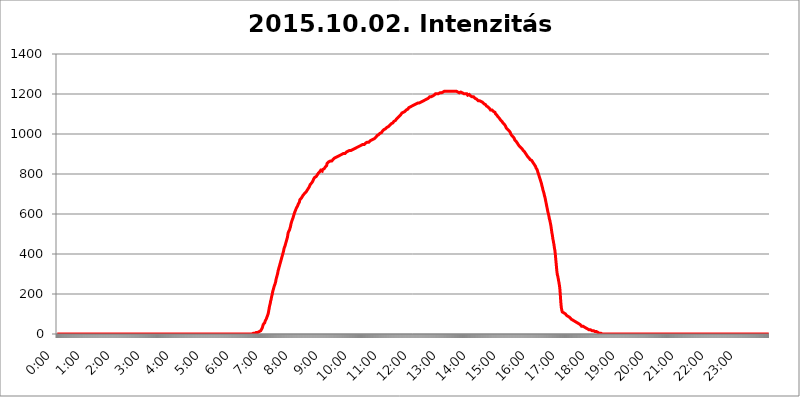
| Category | 2015.10.02. Intenzitás [W/m^2] |
|---|---|
| 0.0 | 0 |
| 0.0006944444444444445 | 0 |
| 0.001388888888888889 | 0 |
| 0.0020833333333333333 | 0 |
| 0.002777777777777778 | 0 |
| 0.003472222222222222 | 0 |
| 0.004166666666666667 | 0 |
| 0.004861111111111111 | 0 |
| 0.005555555555555556 | 0 |
| 0.0062499999999999995 | 0 |
| 0.006944444444444444 | 0 |
| 0.007638888888888889 | 0 |
| 0.008333333333333333 | 0 |
| 0.009027777777777779 | 0 |
| 0.009722222222222222 | 0 |
| 0.010416666666666666 | 0 |
| 0.011111111111111112 | 0 |
| 0.011805555555555555 | 0 |
| 0.012499999999999999 | 0 |
| 0.013194444444444444 | 0 |
| 0.013888888888888888 | 0 |
| 0.014583333333333332 | 0 |
| 0.015277777777777777 | 0 |
| 0.015972222222222224 | 0 |
| 0.016666666666666666 | 0 |
| 0.017361111111111112 | 0 |
| 0.018055555555555557 | 0 |
| 0.01875 | 0 |
| 0.019444444444444445 | 0 |
| 0.02013888888888889 | 0 |
| 0.020833333333333332 | 0 |
| 0.02152777777777778 | 0 |
| 0.022222222222222223 | 0 |
| 0.02291666666666667 | 0 |
| 0.02361111111111111 | 0 |
| 0.024305555555555556 | 0 |
| 0.024999999999999998 | 0 |
| 0.025694444444444447 | 0 |
| 0.02638888888888889 | 0 |
| 0.027083333333333334 | 0 |
| 0.027777777777777776 | 0 |
| 0.02847222222222222 | 0 |
| 0.029166666666666664 | 0 |
| 0.029861111111111113 | 0 |
| 0.030555555555555555 | 0 |
| 0.03125 | 0 |
| 0.03194444444444445 | 0 |
| 0.03263888888888889 | 0 |
| 0.03333333333333333 | 0 |
| 0.034027777777777775 | 0 |
| 0.034722222222222224 | 0 |
| 0.035416666666666666 | 0 |
| 0.036111111111111115 | 0 |
| 0.03680555555555556 | 0 |
| 0.0375 | 0 |
| 0.03819444444444444 | 0 |
| 0.03888888888888889 | 0 |
| 0.03958333333333333 | 0 |
| 0.04027777777777778 | 0 |
| 0.04097222222222222 | 0 |
| 0.041666666666666664 | 0 |
| 0.042361111111111106 | 0 |
| 0.04305555555555556 | 0 |
| 0.043750000000000004 | 0 |
| 0.044444444444444446 | 0 |
| 0.04513888888888889 | 0 |
| 0.04583333333333334 | 0 |
| 0.04652777777777778 | 0 |
| 0.04722222222222222 | 0 |
| 0.04791666666666666 | 0 |
| 0.04861111111111111 | 0 |
| 0.049305555555555554 | 0 |
| 0.049999999999999996 | 0 |
| 0.05069444444444445 | 0 |
| 0.051388888888888894 | 0 |
| 0.052083333333333336 | 0 |
| 0.05277777777777778 | 0 |
| 0.05347222222222222 | 0 |
| 0.05416666666666667 | 0 |
| 0.05486111111111111 | 0 |
| 0.05555555555555555 | 0 |
| 0.05625 | 0 |
| 0.05694444444444444 | 0 |
| 0.057638888888888885 | 0 |
| 0.05833333333333333 | 0 |
| 0.05902777777777778 | 0 |
| 0.059722222222222225 | 0 |
| 0.06041666666666667 | 0 |
| 0.061111111111111116 | 0 |
| 0.06180555555555556 | 0 |
| 0.0625 | 0 |
| 0.06319444444444444 | 0 |
| 0.06388888888888888 | 0 |
| 0.06458333333333334 | 0 |
| 0.06527777777777778 | 0 |
| 0.06597222222222222 | 0 |
| 0.06666666666666667 | 0 |
| 0.06736111111111111 | 0 |
| 0.06805555555555555 | 0 |
| 0.06874999999999999 | 0 |
| 0.06944444444444443 | 0 |
| 0.07013888888888889 | 0 |
| 0.07083333333333333 | 0 |
| 0.07152777777777779 | 0 |
| 0.07222222222222223 | 0 |
| 0.07291666666666667 | 0 |
| 0.07361111111111111 | 0 |
| 0.07430555555555556 | 0 |
| 0.075 | 0 |
| 0.07569444444444444 | 0 |
| 0.0763888888888889 | 0 |
| 0.07708333333333334 | 0 |
| 0.07777777777777778 | 0 |
| 0.07847222222222222 | 0 |
| 0.07916666666666666 | 0 |
| 0.0798611111111111 | 0 |
| 0.08055555555555556 | 0 |
| 0.08125 | 0 |
| 0.08194444444444444 | 0 |
| 0.08263888888888889 | 0 |
| 0.08333333333333333 | 0 |
| 0.08402777777777777 | 0 |
| 0.08472222222222221 | 0 |
| 0.08541666666666665 | 0 |
| 0.08611111111111112 | 0 |
| 0.08680555555555557 | 0 |
| 0.08750000000000001 | 0 |
| 0.08819444444444445 | 0 |
| 0.08888888888888889 | 0 |
| 0.08958333333333333 | 0 |
| 0.09027777777777778 | 0 |
| 0.09097222222222222 | 0 |
| 0.09166666666666667 | 0 |
| 0.09236111111111112 | 0 |
| 0.09305555555555556 | 0 |
| 0.09375 | 0 |
| 0.09444444444444444 | 0 |
| 0.09513888888888888 | 0 |
| 0.09583333333333333 | 0 |
| 0.09652777777777777 | 0 |
| 0.09722222222222222 | 0 |
| 0.09791666666666667 | 0 |
| 0.09861111111111111 | 0 |
| 0.09930555555555555 | 0 |
| 0.09999999999999999 | 0 |
| 0.10069444444444443 | 0 |
| 0.1013888888888889 | 0 |
| 0.10208333333333335 | 0 |
| 0.10277777777777779 | 0 |
| 0.10347222222222223 | 0 |
| 0.10416666666666667 | 0 |
| 0.10486111111111111 | 0 |
| 0.10555555555555556 | 0 |
| 0.10625 | 0 |
| 0.10694444444444444 | 0 |
| 0.1076388888888889 | 0 |
| 0.10833333333333334 | 0 |
| 0.10902777777777778 | 0 |
| 0.10972222222222222 | 0 |
| 0.1111111111111111 | 0 |
| 0.11180555555555556 | 0 |
| 0.11180555555555556 | 0 |
| 0.1125 | 0 |
| 0.11319444444444444 | 0 |
| 0.11388888888888889 | 0 |
| 0.11458333333333333 | 0 |
| 0.11527777777777777 | 0 |
| 0.11597222222222221 | 0 |
| 0.11666666666666665 | 0 |
| 0.1173611111111111 | 0 |
| 0.11805555555555557 | 0 |
| 0.11944444444444445 | 0 |
| 0.12013888888888889 | 0 |
| 0.12083333333333333 | 0 |
| 0.12152777777777778 | 0 |
| 0.12222222222222223 | 0 |
| 0.12291666666666667 | 0 |
| 0.12291666666666667 | 0 |
| 0.12361111111111112 | 0 |
| 0.12430555555555556 | 0 |
| 0.125 | 0 |
| 0.12569444444444444 | 0 |
| 0.12638888888888888 | 0 |
| 0.12708333333333333 | 0 |
| 0.16875 | 0 |
| 0.12847222222222224 | 0 |
| 0.12916666666666668 | 0 |
| 0.12986111111111112 | 0 |
| 0.13055555555555556 | 0 |
| 0.13125 | 0 |
| 0.13194444444444445 | 0 |
| 0.1326388888888889 | 0 |
| 0.13333333333333333 | 0 |
| 0.13402777777777777 | 0 |
| 0.13402777777777777 | 0 |
| 0.13472222222222222 | 0 |
| 0.13541666666666666 | 0 |
| 0.1361111111111111 | 0 |
| 0.13749999999999998 | 0 |
| 0.13819444444444443 | 0 |
| 0.1388888888888889 | 0 |
| 0.13958333333333334 | 0 |
| 0.14027777777777778 | 0 |
| 0.14097222222222222 | 0 |
| 0.14166666666666666 | 0 |
| 0.1423611111111111 | 0 |
| 0.14305555555555557 | 0 |
| 0.14375000000000002 | 0 |
| 0.14444444444444446 | 0 |
| 0.1451388888888889 | 0 |
| 0.1451388888888889 | 0 |
| 0.14652777777777778 | 0 |
| 0.14722222222222223 | 0 |
| 0.14791666666666667 | 0 |
| 0.1486111111111111 | 0 |
| 0.14930555555555555 | 0 |
| 0.15 | 0 |
| 0.15069444444444444 | 0 |
| 0.15138888888888888 | 0 |
| 0.15208333333333332 | 0 |
| 0.15277777777777776 | 0 |
| 0.15347222222222223 | 0 |
| 0.15416666666666667 | 0 |
| 0.15486111111111112 | 0 |
| 0.15555555555555556 | 0 |
| 0.15625 | 0 |
| 0.15694444444444444 | 0 |
| 0.15763888888888888 | 0 |
| 0.15833333333333333 | 0 |
| 0.15902777777777777 | 0 |
| 0.15972222222222224 | 0 |
| 0.16041666666666668 | 0 |
| 0.16111111111111112 | 0 |
| 0.16180555555555556 | 0 |
| 0.1625 | 0 |
| 0.16319444444444445 | 0 |
| 0.1638888888888889 | 0 |
| 0.16458333333333333 | 0 |
| 0.16527777777777777 | 0 |
| 0.16597222222222222 | 0 |
| 0.16666666666666666 | 0 |
| 0.1673611111111111 | 0 |
| 0.16805555555555554 | 0 |
| 0.16874999999999998 | 0 |
| 0.16944444444444443 | 0 |
| 0.17013888888888887 | 0 |
| 0.1708333333333333 | 0 |
| 0.17152777777777775 | 0 |
| 0.17222222222222225 | 0 |
| 0.1729166666666667 | 0 |
| 0.17361111111111113 | 0 |
| 0.17430555555555557 | 0 |
| 0.17500000000000002 | 0 |
| 0.17569444444444446 | 0 |
| 0.1763888888888889 | 0 |
| 0.17708333333333334 | 0 |
| 0.17777777777777778 | 0 |
| 0.17847222222222223 | 0 |
| 0.17916666666666667 | 0 |
| 0.1798611111111111 | 0 |
| 0.18055555555555555 | 0 |
| 0.18125 | 0 |
| 0.18194444444444444 | 0 |
| 0.1826388888888889 | 0 |
| 0.18333333333333335 | 0 |
| 0.1840277777777778 | 0 |
| 0.18472222222222223 | 0 |
| 0.18541666666666667 | 0 |
| 0.18611111111111112 | 0 |
| 0.18680555555555556 | 0 |
| 0.1875 | 0 |
| 0.18819444444444444 | 0 |
| 0.18888888888888888 | 0 |
| 0.18958333333333333 | 0 |
| 0.19027777777777777 | 0 |
| 0.1909722222222222 | 0 |
| 0.19166666666666665 | 0 |
| 0.19236111111111112 | 0 |
| 0.19305555555555554 | 0 |
| 0.19375 | 0 |
| 0.19444444444444445 | 0 |
| 0.1951388888888889 | 0 |
| 0.19583333333333333 | 0 |
| 0.19652777777777777 | 0 |
| 0.19722222222222222 | 0 |
| 0.19791666666666666 | 0 |
| 0.1986111111111111 | 0 |
| 0.19930555555555554 | 0 |
| 0.19999999999999998 | 0 |
| 0.20069444444444443 | 0 |
| 0.20138888888888887 | 0 |
| 0.2020833333333333 | 0 |
| 0.2027777777777778 | 0 |
| 0.2034722222222222 | 0 |
| 0.2041666666666667 | 0 |
| 0.20486111111111113 | 0 |
| 0.20555555555555557 | 0 |
| 0.20625000000000002 | 0 |
| 0.20694444444444446 | 0 |
| 0.2076388888888889 | 0 |
| 0.20833333333333334 | 0 |
| 0.20902777777777778 | 0 |
| 0.20972222222222223 | 0 |
| 0.21041666666666667 | 0 |
| 0.2111111111111111 | 0 |
| 0.21180555555555555 | 0 |
| 0.2125 | 0 |
| 0.21319444444444444 | 0 |
| 0.2138888888888889 | 0 |
| 0.21458333333333335 | 0 |
| 0.2152777777777778 | 0 |
| 0.21597222222222223 | 0 |
| 0.21666666666666667 | 0 |
| 0.21736111111111112 | 0 |
| 0.21805555555555556 | 0 |
| 0.21875 | 0 |
| 0.21944444444444444 | 0 |
| 0.22013888888888888 | 0 |
| 0.22083333333333333 | 0 |
| 0.22152777777777777 | 0 |
| 0.2222222222222222 | 0 |
| 0.22291666666666665 | 0 |
| 0.2236111111111111 | 0 |
| 0.22430555555555556 | 0 |
| 0.225 | 0 |
| 0.22569444444444445 | 0 |
| 0.2263888888888889 | 0 |
| 0.22708333333333333 | 0 |
| 0.22777777777777777 | 0 |
| 0.22847222222222222 | 0 |
| 0.22916666666666666 | 0 |
| 0.2298611111111111 | 0 |
| 0.23055555555555554 | 0 |
| 0.23124999999999998 | 0 |
| 0.23194444444444443 | 0 |
| 0.23263888888888887 | 0 |
| 0.2333333333333333 | 0 |
| 0.2340277777777778 | 0 |
| 0.2347222222222222 | 0 |
| 0.2354166666666667 | 0 |
| 0.23611111111111113 | 0 |
| 0.23680555555555557 | 0 |
| 0.23750000000000002 | 0 |
| 0.23819444444444446 | 0 |
| 0.2388888888888889 | 0 |
| 0.23958333333333334 | 0 |
| 0.24027777777777778 | 0 |
| 0.24097222222222223 | 0 |
| 0.24166666666666667 | 0 |
| 0.2423611111111111 | 0 |
| 0.24305555555555555 | 0 |
| 0.24375 | 0 |
| 0.24444444444444446 | 0 |
| 0.24513888888888888 | 0 |
| 0.24583333333333335 | 0 |
| 0.2465277777777778 | 0 |
| 0.24722222222222223 | 0 |
| 0.24791666666666667 | 0 |
| 0.24861111111111112 | 0 |
| 0.24930555555555556 | 0 |
| 0.25 | 0 |
| 0.25069444444444444 | 0 |
| 0.2513888888888889 | 0 |
| 0.2520833333333333 | 0 |
| 0.25277777777777777 | 0 |
| 0.2534722222222222 | 0 |
| 0.25416666666666665 | 0 |
| 0.2548611111111111 | 0 |
| 0.2555555555555556 | 0 |
| 0.25625000000000003 | 0 |
| 0.2569444444444445 | 0 |
| 0.2576388888888889 | 0 |
| 0.25833333333333336 | 0 |
| 0.2590277777777778 | 0 |
| 0.25972222222222224 | 0 |
| 0.2604166666666667 | 0 |
| 0.2611111111111111 | 0 |
| 0.26180555555555557 | 0 |
| 0.2625 | 0 |
| 0.26319444444444445 | 0 |
| 0.2638888888888889 | 0 |
| 0.26458333333333334 | 0 |
| 0.2652777777777778 | 0 |
| 0.2659722222222222 | 0 |
| 0.26666666666666666 | 0 |
| 0.2673611111111111 | 0 |
| 0.26805555555555555 | 0 |
| 0.26875 | 0 |
| 0.26944444444444443 | 0 |
| 0.2701388888888889 | 0 |
| 0.2708333333333333 | 0 |
| 0.27152777777777776 | 0 |
| 0.2722222222222222 | 0 |
| 0.27291666666666664 | 0 |
| 0.2736111111111111 | 0 |
| 0.2743055555555555 | 3.525 |
| 0.27499999999999997 | 3.525 |
| 0.27569444444444446 | 3.525 |
| 0.27638888888888885 | 3.525 |
| 0.27708333333333335 | 3.525 |
| 0.2777777777777778 | 3.525 |
| 0.27847222222222223 | 3.525 |
| 0.2791666666666667 | 7.887 |
| 0.2798611111111111 | 7.887 |
| 0.28055555555555556 | 7.887 |
| 0.28125 | 7.887 |
| 0.28194444444444444 | 12.257 |
| 0.2826388888888889 | 12.257 |
| 0.2833333333333333 | 12.257 |
| 0.28402777777777777 | 12.257 |
| 0.2847222222222222 | 12.257 |
| 0.28541666666666665 | 16.636 |
| 0.28611111111111115 | 16.636 |
| 0.28680555555555554 | 21.024 |
| 0.28750000000000003 | 29.823 |
| 0.2881944444444445 | 38.653 |
| 0.2888888888888889 | 47.511 |
| 0.28958333333333336 | 51.951 |
| 0.2902777777777778 | 51.951 |
| 0.29097222222222224 | 56.398 |
| 0.2916666666666667 | 65.31 |
| 0.2923611111111111 | 69.775 |
| 0.29305555555555557 | 74.246 |
| 0.29375 | 78.722 |
| 0.29444444444444445 | 87.692 |
| 0.2951388888888889 | 92.184 |
| 0.29583333333333334 | 101.184 |
| 0.2965277777777778 | 114.716 |
| 0.2972222222222222 | 128.284 |
| 0.29791666666666666 | 141.884 |
| 0.2986111111111111 | 150.964 |
| 0.29930555555555555 | 164.605 |
| 0.3 | 173.709 |
| 0.30069444444444443 | 187.378 |
| 0.3013888888888889 | 196.497 |
| 0.3020833333333333 | 210.182 |
| 0.30277777777777776 | 219.309 |
| 0.3034722222222222 | 228.436 |
| 0.30416666666666664 | 237.564 |
| 0.3048611111111111 | 242.127 |
| 0.3055555555555555 | 251.251 |
| 0.30624999999999997 | 260.373 |
| 0.3069444444444444 | 274.047 |
| 0.3076388888888889 | 283.156 |
| 0.30833333333333335 | 292.259 |
| 0.3090277777777778 | 301.354 |
| 0.30972222222222223 | 314.98 |
| 0.3104166666666667 | 324.052 |
| 0.3111111111111111 | 333.113 |
| 0.31180555555555556 | 342.162 |
| 0.3125 | 351.198 |
| 0.31319444444444444 | 360.221 |
| 0.3138888888888889 | 369.23 |
| 0.3145833333333333 | 378.224 |
| 0.31527777777777777 | 387.202 |
| 0.3159722222222222 | 396.164 |
| 0.31666666666666665 | 405.108 |
| 0.31736111111111115 | 414.035 |
| 0.31805555555555554 | 427.39 |
| 0.31875000000000003 | 431.833 |
| 0.3194444444444445 | 440.702 |
| 0.3201388888888889 | 449.551 |
| 0.32083333333333336 | 458.38 |
| 0.3215277777777778 | 467.187 |
| 0.32222222222222224 | 475.972 |
| 0.3229166666666667 | 484.735 |
| 0.3236111111111111 | 502.192 |
| 0.32430555555555557 | 510.885 |
| 0.325 | 515.223 |
| 0.32569444444444445 | 519.555 |
| 0.3263888888888889 | 528.2 |
| 0.32708333333333334 | 536.82 |
| 0.3277777777777778 | 549.704 |
| 0.3284722222222222 | 558.261 |
| 0.32916666666666666 | 566.793 |
| 0.3298611111111111 | 571.049 |
| 0.33055555555555555 | 579.542 |
| 0.33125 | 588.009 |
| 0.33194444444444443 | 596.45 |
| 0.3326388888888889 | 604.864 |
| 0.3333333333333333 | 609.062 |
| 0.3340277777777778 | 617.436 |
| 0.3347222222222222 | 621.613 |
| 0.3354166666666667 | 629.948 |
| 0.3361111111111111 | 634.105 |
| 0.3368055555555556 | 638.256 |
| 0.33749999999999997 | 642.4 |
| 0.33819444444444446 | 650.667 |
| 0.33888888888888885 | 654.791 |
| 0.33958333333333335 | 658.909 |
| 0.34027777777777773 | 671.22 |
| 0.34097222222222223 | 675.311 |
| 0.3416666666666666 | 675.311 |
| 0.3423611111111111 | 679.395 |
| 0.3430555555555555 | 683.473 |
| 0.34375 | 687.544 |
| 0.3444444444444445 | 691.608 |
| 0.3451388888888889 | 695.666 |
| 0.3458333333333334 | 695.666 |
| 0.34652777777777777 | 699.717 |
| 0.34722222222222227 | 703.762 |
| 0.34791666666666665 | 707.8 |
| 0.34861111111111115 | 707.8 |
| 0.34930555555555554 | 711.832 |
| 0.35000000000000003 | 715.858 |
| 0.3506944444444444 | 719.877 |
| 0.3513888888888889 | 723.889 |
| 0.3520833333333333 | 727.896 |
| 0.3527777777777778 | 731.896 |
| 0.3534722222222222 | 735.89 |
| 0.3541666666666667 | 739.877 |
| 0.3548611111111111 | 747.834 |
| 0.35555555555555557 | 751.803 |
| 0.35625 | 751.803 |
| 0.35694444444444445 | 755.766 |
| 0.3576388888888889 | 759.723 |
| 0.35833333333333334 | 763.674 |
| 0.3590277777777778 | 767.62 |
| 0.3597222222222222 | 775.492 |
| 0.36041666666666666 | 775.492 |
| 0.3611111111111111 | 783.342 |
| 0.36180555555555555 | 787.258 |
| 0.3625 | 787.258 |
| 0.36319444444444443 | 787.258 |
| 0.3638888888888889 | 791.169 |
| 0.3645833333333333 | 795.074 |
| 0.3652777777777778 | 798.974 |
| 0.3659722222222222 | 802.868 |
| 0.3666666666666667 | 802.868 |
| 0.3673611111111111 | 806.757 |
| 0.3680555555555556 | 810.641 |
| 0.36874999999999997 | 814.519 |
| 0.36944444444444446 | 818.392 |
| 0.37013888888888885 | 814.519 |
| 0.37083333333333335 | 814.519 |
| 0.37152777777777773 | 814.519 |
| 0.37222222222222223 | 822.26 |
| 0.3729166666666666 | 826.123 |
| 0.3736111111111111 | 826.123 |
| 0.3743055555555555 | 826.123 |
| 0.375 | 829.981 |
| 0.3756944444444445 | 833.834 |
| 0.3763888888888889 | 837.682 |
| 0.3770833333333334 | 837.682 |
| 0.37777777777777777 | 841.526 |
| 0.37847222222222227 | 853.029 |
| 0.37916666666666665 | 853.029 |
| 0.37986111111111115 | 853.029 |
| 0.38055555555555554 | 860.676 |
| 0.38125000000000003 | 856.855 |
| 0.3819444444444444 | 856.855 |
| 0.3826388888888889 | 864.493 |
| 0.3833333333333333 | 860.676 |
| 0.3840277777777778 | 864.493 |
| 0.3847222222222222 | 864.493 |
| 0.3854166666666667 | 868.305 |
| 0.3861111111111111 | 868.305 |
| 0.38680555555555557 | 872.114 |
| 0.3875 | 875.918 |
| 0.38819444444444445 | 875.918 |
| 0.3888888888888889 | 879.719 |
| 0.38958333333333334 | 879.719 |
| 0.3902777777777778 | 879.719 |
| 0.3909722222222222 | 883.516 |
| 0.39166666666666666 | 883.516 |
| 0.3923611111111111 | 883.516 |
| 0.39305555555555555 | 887.309 |
| 0.39375 | 887.309 |
| 0.39444444444444443 | 891.099 |
| 0.3951388888888889 | 891.099 |
| 0.3958333333333333 | 891.099 |
| 0.3965277777777778 | 891.099 |
| 0.3972222222222222 | 894.885 |
| 0.3979166666666667 | 894.885 |
| 0.3986111111111111 | 898.668 |
| 0.3993055555555556 | 898.668 |
| 0.39999999999999997 | 898.668 |
| 0.40069444444444446 | 902.447 |
| 0.40138888888888885 | 902.447 |
| 0.40208333333333335 | 902.447 |
| 0.40277777777777773 | 902.447 |
| 0.40347222222222223 | 902.447 |
| 0.4041666666666666 | 906.223 |
| 0.4048611111111111 | 906.223 |
| 0.4055555555555555 | 909.996 |
| 0.40625 | 909.996 |
| 0.4069444444444445 | 909.996 |
| 0.4076388888888889 | 913.766 |
| 0.4083333333333334 | 913.766 |
| 0.40902777777777777 | 913.766 |
| 0.40972222222222227 | 917.534 |
| 0.41041666666666665 | 917.534 |
| 0.41111111111111115 | 917.534 |
| 0.41180555555555554 | 917.534 |
| 0.41250000000000003 | 921.298 |
| 0.4131944444444444 | 921.298 |
| 0.4138888888888889 | 921.298 |
| 0.4145833333333333 | 925.06 |
| 0.4152777777777778 | 925.06 |
| 0.4159722222222222 | 925.06 |
| 0.4166666666666667 | 925.06 |
| 0.4173611111111111 | 925.06 |
| 0.41805555555555557 | 928.819 |
| 0.41875 | 932.576 |
| 0.41944444444444445 | 932.576 |
| 0.4201388888888889 | 932.576 |
| 0.42083333333333334 | 932.576 |
| 0.4215277777777778 | 936.33 |
| 0.4222222222222222 | 936.33 |
| 0.42291666666666666 | 936.33 |
| 0.4236111111111111 | 940.082 |
| 0.42430555555555555 | 940.082 |
| 0.425 | 940.082 |
| 0.42569444444444443 | 943.832 |
| 0.4263888888888889 | 943.832 |
| 0.4270833333333333 | 940.082 |
| 0.4277777777777778 | 943.832 |
| 0.4284722222222222 | 947.58 |
| 0.4291666666666667 | 947.58 |
| 0.4298611111111111 | 947.58 |
| 0.4305555555555556 | 947.58 |
| 0.43124999999999997 | 951.327 |
| 0.43194444444444446 | 951.327 |
| 0.43263888888888885 | 955.071 |
| 0.43333333333333335 | 955.071 |
| 0.43402777777777773 | 955.071 |
| 0.43472222222222223 | 958.814 |
| 0.4354166666666666 | 958.814 |
| 0.4361111111111111 | 958.814 |
| 0.4368055555555555 | 958.814 |
| 0.4375 | 958.814 |
| 0.4381944444444445 | 958.814 |
| 0.4388888888888889 | 966.295 |
| 0.4395833333333334 | 966.295 |
| 0.44027777777777777 | 970.034 |
| 0.44097222222222227 | 970.034 |
| 0.44166666666666665 | 970.034 |
| 0.44236111111111115 | 970.034 |
| 0.44305555555555554 | 973.772 |
| 0.44375000000000003 | 973.772 |
| 0.4444444444444444 | 977.508 |
| 0.4451388888888889 | 977.508 |
| 0.4458333333333333 | 977.508 |
| 0.4465277777777778 | 981.244 |
| 0.4472222222222222 | 984.98 |
| 0.4479166666666667 | 988.714 |
| 0.4486111111111111 | 992.448 |
| 0.44930555555555557 | 992.448 |
| 0.45 | 996.182 |
| 0.45069444444444445 | 996.182 |
| 0.4513888888888889 | 999.916 |
| 0.45208333333333334 | 999.916 |
| 0.4527777777777778 | 1003.65 |
| 0.4534722222222222 | 1007.383 |
| 0.45416666666666666 | 1003.65 |
| 0.4548611111111111 | 1007.383 |
| 0.45555555555555555 | 1007.383 |
| 0.45625 | 1014.852 |
| 0.45694444444444443 | 1014.852 |
| 0.4576388888888889 | 1018.587 |
| 0.4583333333333333 | 1022.323 |
| 0.4590277777777778 | 1022.323 |
| 0.4597222222222222 | 1022.323 |
| 0.4604166666666667 | 1026.06 |
| 0.4611111111111111 | 1029.798 |
| 0.4618055555555556 | 1029.798 |
| 0.46249999999999997 | 1033.537 |
| 0.46319444444444446 | 1037.277 |
| 0.46388888888888885 | 1033.537 |
| 0.46458333333333335 | 1037.277 |
| 0.46527777777777773 | 1037.277 |
| 0.46597222222222223 | 1041.019 |
| 0.4666666666666666 | 1044.762 |
| 0.4673611111111111 | 1044.762 |
| 0.4680555555555555 | 1048.508 |
| 0.46875 | 1052.255 |
| 0.4694444444444445 | 1048.508 |
| 0.4701388888888889 | 1048.508 |
| 0.4708333333333334 | 1056.004 |
| 0.47152777777777777 | 1059.756 |
| 0.47222222222222227 | 1063.51 |
| 0.47291666666666665 | 1067.267 |
| 0.47361111111111115 | 1067.267 |
| 0.47430555555555554 | 1067.267 |
| 0.47500000000000003 | 1071.027 |
| 0.4756944444444444 | 1074.789 |
| 0.4763888888888889 | 1078.555 |
| 0.4770833333333333 | 1078.555 |
| 0.4777777777777778 | 1082.324 |
| 0.4784722222222222 | 1082.324 |
| 0.4791666666666667 | 1086.097 |
| 0.4798611111111111 | 1089.873 |
| 0.48055555555555557 | 1093.653 |
| 0.48125 | 1093.653 |
| 0.48194444444444445 | 1097.437 |
| 0.4826388888888889 | 1101.226 |
| 0.48333333333333334 | 1105.019 |
| 0.4840277777777778 | 1105.019 |
| 0.4847222222222222 | 1108.816 |
| 0.48541666666666666 | 1108.816 |
| 0.4861111111111111 | 1112.618 |
| 0.48680555555555555 | 1112.618 |
| 0.4875 | 1112.618 |
| 0.48819444444444443 | 1116.426 |
| 0.4888888888888889 | 1116.426 |
| 0.4895833333333333 | 1120.238 |
| 0.4902777777777778 | 1120.238 |
| 0.4909722222222222 | 1124.056 |
| 0.4916666666666667 | 1124.056 |
| 0.4923611111111111 | 1127.879 |
| 0.4930555555555556 | 1131.708 |
| 0.49374999999999997 | 1131.708 |
| 0.49444444444444446 | 1131.708 |
| 0.49513888888888885 | 1135.543 |
| 0.49583333333333335 | 1139.384 |
| 0.49652777777777773 | 1139.384 |
| 0.49722222222222223 | 1139.384 |
| 0.4979166666666666 | 1139.384 |
| 0.4986111111111111 | 1143.232 |
| 0.4993055555555555 | 1143.232 |
| 0.5 | 1143.232 |
| 0.5006944444444444 | 1143.232 |
| 0.5013888888888889 | 1147.086 |
| 0.5020833333333333 | 1147.086 |
| 0.5027777777777778 | 1150.946 |
| 0.5034722222222222 | 1150.946 |
| 0.5041666666666667 | 1154.814 |
| 0.5048611111111111 | 1150.946 |
| 0.5055555555555555 | 1154.814 |
| 0.50625 | 1154.814 |
| 0.5069444444444444 | 1154.814 |
| 0.5076388888888889 | 1154.814 |
| 0.5083333333333333 | 1154.814 |
| 0.5090277777777777 | 1158.689 |
| 0.5097222222222222 | 1158.689 |
| 0.5104166666666666 | 1158.689 |
| 0.5111111111111112 | 1162.571 |
| 0.5118055555555555 | 1162.571 |
| 0.5125000000000001 | 1162.571 |
| 0.5131944444444444 | 1166.46 |
| 0.513888888888889 | 1166.46 |
| 0.5145833333333333 | 1170.358 |
| 0.5152777777777778 | 1170.358 |
| 0.5159722222222222 | 1170.358 |
| 0.5166666666666667 | 1170.358 |
| 0.517361111111111 | 1170.358 |
| 0.5180555555555556 | 1174.263 |
| 0.5187499999999999 | 1174.263 |
| 0.5194444444444445 | 1178.177 |
| 0.5201388888888888 | 1178.177 |
| 0.5208333333333334 | 1182.099 |
| 0.5215277777777778 | 1182.099 |
| 0.5222222222222223 | 1186.03 |
| 0.5229166666666667 | 1186.03 |
| 0.5236111111111111 | 1189.969 |
| 0.5243055555555556 | 1186.03 |
| 0.525 | 1189.969 |
| 0.5256944444444445 | 1189.969 |
| 0.5263888888888889 | 1189.969 |
| 0.5270833333333333 | 1193.918 |
| 0.5277777777777778 | 1193.918 |
| 0.5284722222222222 | 1193.918 |
| 0.5291666666666667 | 1193.918 |
| 0.5298611111111111 | 1197.876 |
| 0.5305555555555556 | 1201.843 |
| 0.53125 | 1197.876 |
| 0.5319444444444444 | 1201.843 |
| 0.5326388888888889 | 1201.843 |
| 0.5333333333333333 | 1201.843 |
| 0.5340277777777778 | 1201.843 |
| 0.5347222222222222 | 1201.843 |
| 0.5354166666666667 | 1205.82 |
| 0.5361111111111111 | 1205.82 |
| 0.5368055555555555 | 1205.82 |
| 0.5375 | 1205.82 |
| 0.5381944444444444 | 1205.82 |
| 0.5388888888888889 | 1205.82 |
| 0.5395833333333333 | 1205.82 |
| 0.5402777777777777 | 1209.807 |
| 0.5409722222222222 | 1209.807 |
| 0.5416666666666666 | 1209.807 |
| 0.5423611111111112 | 1213.804 |
| 0.5430555555555555 | 1213.804 |
| 0.5437500000000001 | 1213.804 |
| 0.5444444444444444 | 1209.807 |
| 0.545138888888889 | 1213.804 |
| 0.5458333333333333 | 1209.807 |
| 0.5465277777777778 | 1213.804 |
| 0.5472222222222222 | 1213.804 |
| 0.5479166666666667 | 1213.804 |
| 0.548611111111111 | 1213.804 |
| 0.5493055555555556 | 1213.804 |
| 0.5499999999999999 | 1213.804 |
| 0.5506944444444445 | 1213.804 |
| 0.5513888888888888 | 1213.804 |
| 0.5520833333333334 | 1213.804 |
| 0.5527777777777778 | 1213.804 |
| 0.5534722222222223 | 1213.804 |
| 0.5541666666666667 | 1213.804 |
| 0.5548611111111111 | 1213.804 |
| 0.5555555555555556 | 1213.804 |
| 0.55625 | 1209.807 |
| 0.5569444444444445 | 1213.804 |
| 0.5576388888888889 | 1213.804 |
| 0.5583333333333333 | 1213.804 |
| 0.5590277777777778 | 1209.807 |
| 0.5597222222222222 | 1213.804 |
| 0.5604166666666667 | 1213.804 |
| 0.5611111111111111 | 1213.804 |
| 0.5618055555555556 | 1209.807 |
| 0.5625 | 1209.807 |
| 0.5631944444444444 | 1209.807 |
| 0.5638888888888889 | 1205.82 |
| 0.5645833333333333 | 1205.82 |
| 0.5652777777777778 | 1205.82 |
| 0.5659722222222222 | 1209.807 |
| 0.5666666666666667 | 1209.807 |
| 0.5673611111111111 | 1205.82 |
| 0.5680555555555555 | 1205.82 |
| 0.56875 | 1205.82 |
| 0.5694444444444444 | 1205.82 |
| 0.5701388888888889 | 1201.843 |
| 0.5708333333333333 | 1201.843 |
| 0.5715277777777777 | 1201.843 |
| 0.5722222222222222 | 1201.843 |
| 0.5729166666666666 | 1201.843 |
| 0.5736111111111112 | 1201.843 |
| 0.5743055555555555 | 1201.843 |
| 0.5750000000000001 | 1197.876 |
| 0.5756944444444444 | 1193.918 |
| 0.576388888888889 | 1193.918 |
| 0.5770833333333333 | 1193.918 |
| 0.5777777777777778 | 1197.876 |
| 0.5784722222222222 | 1193.918 |
| 0.5791666666666667 | 1193.918 |
| 0.579861111111111 | 1189.969 |
| 0.5805555555555556 | 1189.969 |
| 0.5812499999999999 | 1189.969 |
| 0.5819444444444445 | 1186.03 |
| 0.5826388888888888 | 1186.03 |
| 0.5833333333333334 | 1186.03 |
| 0.5840277777777778 | 1186.03 |
| 0.5847222222222223 | 1182.099 |
| 0.5854166666666667 | 1182.099 |
| 0.5861111111111111 | 1178.177 |
| 0.5868055555555556 | 1178.177 |
| 0.5875 | 1174.263 |
| 0.5881944444444445 | 1174.263 |
| 0.5888888888888889 | 1170.358 |
| 0.5895833333333333 | 1170.358 |
| 0.5902777777777778 | 1166.46 |
| 0.5909722222222222 | 1166.46 |
| 0.5916666666666667 | 1166.46 |
| 0.5923611111111111 | 1166.46 |
| 0.5930555555555556 | 1166.46 |
| 0.59375 | 1166.46 |
| 0.5944444444444444 | 1162.571 |
| 0.5951388888888889 | 1162.571 |
| 0.5958333333333333 | 1158.689 |
| 0.5965277777777778 | 1158.689 |
| 0.5972222222222222 | 1158.689 |
| 0.5979166666666667 | 1154.814 |
| 0.5986111111111111 | 1150.946 |
| 0.5993055555555555 | 1150.946 |
| 0.6 | 1147.086 |
| 0.6006944444444444 | 1147.086 |
| 0.6013888888888889 | 1143.232 |
| 0.6020833333333333 | 1139.384 |
| 0.6027777777777777 | 1139.384 |
| 0.6034722222222222 | 1135.543 |
| 0.6041666666666666 | 1135.543 |
| 0.6048611111111112 | 1131.708 |
| 0.6055555555555555 | 1131.708 |
| 0.6062500000000001 | 1127.879 |
| 0.6069444444444444 | 1124.056 |
| 0.607638888888889 | 1120.238 |
| 0.6083333333333333 | 1120.238 |
| 0.6090277777777778 | 1116.426 |
| 0.6097222222222222 | 1120.238 |
| 0.6104166666666667 | 1116.426 |
| 0.611111111111111 | 1116.426 |
| 0.6118055555555556 | 1112.618 |
| 0.6124999999999999 | 1112.618 |
| 0.6131944444444445 | 1108.816 |
| 0.6138888888888888 | 1108.816 |
| 0.6145833333333334 | 1101.226 |
| 0.6152777777777778 | 1101.226 |
| 0.6159722222222223 | 1097.437 |
| 0.6166666666666667 | 1093.653 |
| 0.6173611111111111 | 1089.873 |
| 0.6180555555555556 | 1086.097 |
| 0.61875 | 1086.097 |
| 0.6194444444444445 | 1082.324 |
| 0.6201388888888889 | 1078.555 |
| 0.6208333333333333 | 1074.789 |
| 0.6215277777777778 | 1071.027 |
| 0.6222222222222222 | 1071.027 |
| 0.6229166666666667 | 1067.267 |
| 0.6236111111111111 | 1063.51 |
| 0.6243055555555556 | 1059.756 |
| 0.625 | 1056.004 |
| 0.6256944444444444 | 1052.255 |
| 0.6263888888888889 | 1052.255 |
| 0.6270833333333333 | 1048.508 |
| 0.6277777777777778 | 1044.762 |
| 0.6284722222222222 | 1041.019 |
| 0.6291666666666667 | 1041.019 |
| 0.6298611111111111 | 1029.798 |
| 0.6305555555555555 | 1029.798 |
| 0.63125 | 1026.06 |
| 0.6319444444444444 | 1022.323 |
| 0.6326388888888889 | 1022.323 |
| 0.6333333333333333 | 1018.587 |
| 0.6340277777777777 | 1014.852 |
| 0.6347222222222222 | 1011.118 |
| 0.6354166666666666 | 1007.383 |
| 0.6361111111111112 | 999.916 |
| 0.6368055555555555 | 999.916 |
| 0.6375000000000001 | 992.448 |
| 0.6381944444444444 | 988.714 |
| 0.638888888888889 | 988.714 |
| 0.6395833333333333 | 984.98 |
| 0.6402777777777778 | 981.244 |
| 0.6409722222222222 | 977.508 |
| 0.6416666666666667 | 970.034 |
| 0.642361111111111 | 966.295 |
| 0.6430555555555556 | 966.295 |
| 0.6437499999999999 | 962.555 |
| 0.6444444444444445 | 958.814 |
| 0.6451388888888888 | 955.071 |
| 0.6458333333333334 | 951.327 |
| 0.6465277777777778 | 947.58 |
| 0.6472222222222223 | 943.832 |
| 0.6479166666666667 | 940.082 |
| 0.6486111111111111 | 940.082 |
| 0.6493055555555556 | 936.33 |
| 0.65 | 932.576 |
| 0.6506944444444445 | 932.576 |
| 0.6513888888888889 | 928.819 |
| 0.6520833333333333 | 925.06 |
| 0.6527777777777778 | 921.298 |
| 0.6534722222222222 | 917.534 |
| 0.6541666666666667 | 917.534 |
| 0.6548611111111111 | 913.766 |
| 0.6555555555555556 | 909.996 |
| 0.65625 | 906.223 |
| 0.6569444444444444 | 902.447 |
| 0.6576388888888889 | 898.668 |
| 0.6583333333333333 | 894.885 |
| 0.6590277777777778 | 891.099 |
| 0.6597222222222222 | 887.309 |
| 0.6604166666666667 | 883.516 |
| 0.6611111111111111 | 883.516 |
| 0.6618055555555555 | 879.719 |
| 0.6625 | 875.918 |
| 0.6631944444444444 | 872.114 |
| 0.6638888888888889 | 872.114 |
| 0.6645833333333333 | 868.305 |
| 0.6652777777777777 | 868.305 |
| 0.6659722222222222 | 864.493 |
| 0.6666666666666666 | 860.676 |
| 0.6673611111111111 | 856.855 |
| 0.6680555555555556 | 853.029 |
| 0.6687500000000001 | 849.199 |
| 0.6694444444444444 | 845.365 |
| 0.6701388888888888 | 841.526 |
| 0.6708333333333334 | 837.682 |
| 0.6715277777777778 | 829.981 |
| 0.6722222222222222 | 826.123 |
| 0.6729166666666666 | 822.26 |
| 0.6736111111111112 | 814.519 |
| 0.6743055555555556 | 806.757 |
| 0.6749999999999999 | 798.974 |
| 0.6756944444444444 | 795.074 |
| 0.6763888888888889 | 783.342 |
| 0.6770833333333334 | 779.42 |
| 0.6777777777777777 | 767.62 |
| 0.6784722222222223 | 759.723 |
| 0.6791666666666667 | 751.803 |
| 0.6798611111111111 | 739.877 |
| 0.6805555555555555 | 731.896 |
| 0.68125 | 719.877 |
| 0.6819444444444445 | 711.832 |
| 0.6826388888888889 | 703.762 |
| 0.6833333333333332 | 691.608 |
| 0.6840277777777778 | 683.473 |
| 0.6847222222222222 | 671.22 |
| 0.6854166666666667 | 658.909 |
| 0.686111111111111 | 646.537 |
| 0.6868055555555556 | 634.105 |
| 0.6875 | 621.613 |
| 0.6881944444444444 | 609.062 |
| 0.688888888888889 | 600.661 |
| 0.6895833333333333 | 588.009 |
| 0.6902777777777778 | 575.299 |
| 0.6909722222222222 | 566.793 |
| 0.6916666666666668 | 553.986 |
| 0.6923611111111111 | 541.121 |
| 0.6930555555555555 | 523.88 |
| 0.69375 | 506.542 |
| 0.6944444444444445 | 493.475 |
| 0.6951388888888889 | 475.972 |
| 0.6958333333333333 | 462.786 |
| 0.6965277777777777 | 449.551 |
| 0.6972222222222223 | 431.833 |
| 0.6979166666666666 | 418.492 |
| 0.6986111111111111 | 396.164 |
| 0.6993055555555556 | 369.23 |
| 0.7000000000000001 | 342.162 |
| 0.7006944444444444 | 314.98 |
| 0.7013888888888888 | 296.808 |
| 0.7020833333333334 | 287.709 |
| 0.7027777777777778 | 274.047 |
| 0.7034722222222222 | 260.373 |
| 0.7041666666666666 | 246.689 |
| 0.7048611111111112 | 228.436 |
| 0.7055555555555556 | 196.497 |
| 0.7062499999999999 | 160.056 |
| 0.7069444444444444 | 132.814 |
| 0.7076388888888889 | 119.235 |
| 0.7083333333333334 | 110.201 |
| 0.7090277777777777 | 110.201 |
| 0.7097222222222223 | 105.69 |
| 0.7104166666666667 | 105.69 |
| 0.7111111111111111 | 101.184 |
| 0.7118055555555555 | 101.184 |
| 0.7125 | 101.184 |
| 0.7131944444444445 | 96.682 |
| 0.7138888888888889 | 96.682 |
| 0.7145833333333332 | 92.184 |
| 0.7152777777777778 | 92.184 |
| 0.7159722222222222 | 87.692 |
| 0.7166666666666667 | 87.692 |
| 0.717361111111111 | 83.205 |
| 0.7180555555555556 | 83.205 |
| 0.71875 | 83.205 |
| 0.7194444444444444 | 78.722 |
| 0.720138888888889 | 78.722 |
| 0.7208333333333333 | 74.246 |
| 0.7215277777777778 | 74.246 |
| 0.7222222222222222 | 74.246 |
| 0.7229166666666668 | 69.775 |
| 0.7236111111111111 | 69.775 |
| 0.7243055555555555 | 65.31 |
| 0.725 | 65.31 |
| 0.7256944444444445 | 65.31 |
| 0.7263888888888889 | 60.85 |
| 0.7270833333333333 | 60.85 |
| 0.7277777777777777 | 60.85 |
| 0.7284722222222223 | 56.398 |
| 0.7291666666666666 | 56.398 |
| 0.7298611111111111 | 56.398 |
| 0.7305555555555556 | 51.951 |
| 0.7312500000000001 | 51.951 |
| 0.7319444444444444 | 47.511 |
| 0.7326388888888888 | 47.511 |
| 0.7333333333333334 | 47.511 |
| 0.7340277777777778 | 47.511 |
| 0.7347222222222222 | 43.079 |
| 0.7354166666666666 | 38.653 |
| 0.7361111111111112 | 38.653 |
| 0.7368055555555556 | 38.653 |
| 0.7374999999999999 | 38.653 |
| 0.7381944444444444 | 34.234 |
| 0.7388888888888889 | 34.234 |
| 0.7395833333333334 | 34.234 |
| 0.7402777777777777 | 29.823 |
| 0.7409722222222223 | 29.823 |
| 0.7416666666666667 | 29.823 |
| 0.7423611111111111 | 29.823 |
| 0.7430555555555555 | 25.419 |
| 0.74375 | 25.419 |
| 0.7444444444444445 | 25.419 |
| 0.7451388888888889 | 25.419 |
| 0.7458333333333332 | 21.024 |
| 0.7465277777777778 | 21.024 |
| 0.7472222222222222 | 21.024 |
| 0.7479166666666667 | 21.024 |
| 0.748611111111111 | 21.024 |
| 0.7493055555555556 | 21.024 |
| 0.75 | 16.636 |
| 0.7506944444444444 | 16.636 |
| 0.751388888888889 | 16.636 |
| 0.7520833333333333 | 16.636 |
| 0.7527777777777778 | 16.636 |
| 0.7534722222222222 | 12.257 |
| 0.7541666666666668 | 12.257 |
| 0.7548611111111111 | 12.257 |
| 0.7555555555555555 | 12.257 |
| 0.75625 | 12.257 |
| 0.7569444444444445 | 7.887 |
| 0.7576388888888889 | 7.887 |
| 0.7583333333333333 | 7.887 |
| 0.7590277777777777 | 7.887 |
| 0.7597222222222223 | 3.525 |
| 0.7604166666666666 | 3.525 |
| 0.7611111111111111 | 3.525 |
| 0.7618055555555556 | 3.525 |
| 0.7625000000000001 | 3.525 |
| 0.7631944444444444 | 3.525 |
| 0.7638888888888888 | 3.525 |
| 0.7645833333333334 | 0 |
| 0.7652777777777778 | 0 |
| 0.7659722222222222 | 0 |
| 0.7666666666666666 | 0 |
| 0.7673611111111112 | 0 |
| 0.7680555555555556 | 0 |
| 0.7687499999999999 | 0 |
| 0.7694444444444444 | 0 |
| 0.7701388888888889 | 0 |
| 0.7708333333333334 | 0 |
| 0.7715277777777777 | 0 |
| 0.7722222222222223 | 0 |
| 0.7729166666666667 | 0 |
| 0.7736111111111111 | 0 |
| 0.7743055555555555 | 0 |
| 0.775 | 0 |
| 0.7756944444444445 | 0 |
| 0.7763888888888889 | 0 |
| 0.7770833333333332 | 0 |
| 0.7777777777777778 | 0 |
| 0.7784722222222222 | 0 |
| 0.7791666666666667 | 0 |
| 0.779861111111111 | 0 |
| 0.7805555555555556 | 0 |
| 0.78125 | 0 |
| 0.7819444444444444 | 0 |
| 0.782638888888889 | 0 |
| 0.7833333333333333 | 0 |
| 0.7840277777777778 | 0 |
| 0.7847222222222222 | 0 |
| 0.7854166666666668 | 0 |
| 0.7861111111111111 | 0 |
| 0.7868055555555555 | 0 |
| 0.7875 | 0 |
| 0.7881944444444445 | 0 |
| 0.7888888888888889 | 0 |
| 0.7895833333333333 | 0 |
| 0.7902777777777777 | 0 |
| 0.7909722222222223 | 0 |
| 0.7916666666666666 | 0 |
| 0.7923611111111111 | 0 |
| 0.7930555555555556 | 0 |
| 0.7937500000000001 | 0 |
| 0.7944444444444444 | 0 |
| 0.7951388888888888 | 0 |
| 0.7958333333333334 | 0 |
| 0.7965277777777778 | 0 |
| 0.7972222222222222 | 0 |
| 0.7979166666666666 | 0 |
| 0.7986111111111112 | 0 |
| 0.7993055555555556 | 0 |
| 0.7999999999999999 | 0 |
| 0.8006944444444444 | 0 |
| 0.8013888888888889 | 0 |
| 0.8020833333333334 | 0 |
| 0.8027777777777777 | 0 |
| 0.8034722222222223 | 0 |
| 0.8041666666666667 | 0 |
| 0.8048611111111111 | 0 |
| 0.8055555555555555 | 0 |
| 0.80625 | 0 |
| 0.8069444444444445 | 0 |
| 0.8076388888888889 | 0 |
| 0.8083333333333332 | 0 |
| 0.8090277777777778 | 0 |
| 0.8097222222222222 | 0 |
| 0.8104166666666667 | 0 |
| 0.811111111111111 | 0 |
| 0.8118055555555556 | 0 |
| 0.8125 | 0 |
| 0.8131944444444444 | 0 |
| 0.813888888888889 | 0 |
| 0.8145833333333333 | 0 |
| 0.8152777777777778 | 0 |
| 0.8159722222222222 | 0 |
| 0.8166666666666668 | 0 |
| 0.8173611111111111 | 0 |
| 0.8180555555555555 | 0 |
| 0.81875 | 0 |
| 0.8194444444444445 | 0 |
| 0.8201388888888889 | 0 |
| 0.8208333333333333 | 0 |
| 0.8215277777777777 | 0 |
| 0.8222222222222223 | 0 |
| 0.8229166666666666 | 0 |
| 0.8236111111111111 | 0 |
| 0.8243055555555556 | 0 |
| 0.8250000000000001 | 0 |
| 0.8256944444444444 | 0 |
| 0.8263888888888888 | 0 |
| 0.8270833333333334 | 0 |
| 0.8277777777777778 | 0 |
| 0.8284722222222222 | 0 |
| 0.8291666666666666 | 0 |
| 0.8298611111111112 | 0 |
| 0.8305555555555556 | 0 |
| 0.8312499999999999 | 0 |
| 0.8319444444444444 | 0 |
| 0.8326388888888889 | 0 |
| 0.8333333333333334 | 0 |
| 0.8340277777777777 | 0 |
| 0.8347222222222223 | 0 |
| 0.8354166666666667 | 0 |
| 0.8361111111111111 | 0 |
| 0.8368055555555555 | 0 |
| 0.8375 | 0 |
| 0.8381944444444445 | 0 |
| 0.8388888888888889 | 0 |
| 0.8395833333333332 | 0 |
| 0.8402777777777778 | 0 |
| 0.8409722222222222 | 0 |
| 0.8416666666666667 | 0 |
| 0.842361111111111 | 0 |
| 0.8430555555555556 | 0 |
| 0.84375 | 0 |
| 0.8444444444444444 | 0 |
| 0.845138888888889 | 0 |
| 0.8458333333333333 | 0 |
| 0.8465277777777778 | 0 |
| 0.8472222222222222 | 0 |
| 0.8479166666666668 | 0 |
| 0.8486111111111111 | 0 |
| 0.8493055555555555 | 0 |
| 0.85 | 0 |
| 0.8506944444444445 | 0 |
| 0.8513888888888889 | 0 |
| 0.8520833333333333 | 0 |
| 0.8527777777777777 | 0 |
| 0.8534722222222223 | 0 |
| 0.8541666666666666 | 0 |
| 0.8548611111111111 | 0 |
| 0.8555555555555556 | 0 |
| 0.8562500000000001 | 0 |
| 0.8569444444444444 | 0 |
| 0.8576388888888888 | 0 |
| 0.8583333333333334 | 0 |
| 0.8590277777777778 | 0 |
| 0.8597222222222222 | 0 |
| 0.8604166666666666 | 0 |
| 0.8611111111111112 | 0 |
| 0.8618055555555556 | 0 |
| 0.8624999999999999 | 0 |
| 0.8631944444444444 | 0 |
| 0.8638888888888889 | 0 |
| 0.8645833333333334 | 0 |
| 0.8652777777777777 | 0 |
| 0.8659722222222223 | 0 |
| 0.8666666666666667 | 0 |
| 0.8673611111111111 | 0 |
| 0.8680555555555555 | 0 |
| 0.86875 | 0 |
| 0.8694444444444445 | 0 |
| 0.8701388888888889 | 0 |
| 0.8708333333333332 | 0 |
| 0.8715277777777778 | 0 |
| 0.8722222222222222 | 0 |
| 0.8729166666666667 | 0 |
| 0.873611111111111 | 0 |
| 0.8743055555555556 | 0 |
| 0.875 | 0 |
| 0.8756944444444444 | 0 |
| 0.876388888888889 | 0 |
| 0.8770833333333333 | 0 |
| 0.8777777777777778 | 0 |
| 0.8784722222222222 | 0 |
| 0.8791666666666668 | 0 |
| 0.8798611111111111 | 0 |
| 0.8805555555555555 | 0 |
| 0.88125 | 0 |
| 0.8819444444444445 | 0 |
| 0.8826388888888889 | 0 |
| 0.8833333333333333 | 0 |
| 0.8840277777777777 | 0 |
| 0.8847222222222223 | 0 |
| 0.8854166666666666 | 0 |
| 0.8861111111111111 | 0 |
| 0.8868055555555556 | 0 |
| 0.8875000000000001 | 0 |
| 0.8881944444444444 | 0 |
| 0.8888888888888888 | 0 |
| 0.8895833333333334 | 0 |
| 0.8902777777777778 | 0 |
| 0.8909722222222222 | 0 |
| 0.8916666666666666 | 0 |
| 0.8923611111111112 | 0 |
| 0.8930555555555556 | 0 |
| 0.8937499999999999 | 0 |
| 0.8944444444444444 | 0 |
| 0.8951388888888889 | 0 |
| 0.8958333333333334 | 0 |
| 0.8965277777777777 | 0 |
| 0.8972222222222223 | 0 |
| 0.8979166666666667 | 0 |
| 0.8986111111111111 | 0 |
| 0.8993055555555555 | 0 |
| 0.9 | 0 |
| 0.9006944444444445 | 0 |
| 0.9013888888888889 | 0 |
| 0.9020833333333332 | 0 |
| 0.9027777777777778 | 0 |
| 0.9034722222222222 | 0 |
| 0.9041666666666667 | 0 |
| 0.904861111111111 | 0 |
| 0.9055555555555556 | 0 |
| 0.90625 | 0 |
| 0.9069444444444444 | 0 |
| 0.907638888888889 | 0 |
| 0.9083333333333333 | 0 |
| 0.9090277777777778 | 0 |
| 0.9097222222222222 | 0 |
| 0.9104166666666668 | 0 |
| 0.9111111111111111 | 0 |
| 0.9118055555555555 | 0 |
| 0.9125 | 0 |
| 0.9131944444444445 | 0 |
| 0.9138888888888889 | 0 |
| 0.9145833333333333 | 0 |
| 0.9152777777777777 | 0 |
| 0.9159722222222223 | 0 |
| 0.9166666666666666 | 0 |
| 0.9173611111111111 | 0 |
| 0.9180555555555556 | 0 |
| 0.9187500000000001 | 0 |
| 0.9194444444444444 | 0 |
| 0.9201388888888888 | 0 |
| 0.9208333333333334 | 0 |
| 0.9215277777777778 | 0 |
| 0.9222222222222222 | 0 |
| 0.9229166666666666 | 0 |
| 0.9236111111111112 | 0 |
| 0.9243055555555556 | 0 |
| 0.9249999999999999 | 0 |
| 0.9256944444444444 | 0 |
| 0.9263888888888889 | 0 |
| 0.9270833333333334 | 0 |
| 0.9277777777777777 | 0 |
| 0.9284722222222223 | 0 |
| 0.9291666666666667 | 0 |
| 0.9298611111111111 | 0 |
| 0.9305555555555555 | 0 |
| 0.93125 | 0 |
| 0.9319444444444445 | 0 |
| 0.9326388888888889 | 0 |
| 0.9333333333333332 | 0 |
| 0.9340277777777778 | 0 |
| 0.9347222222222222 | 0 |
| 0.9354166666666667 | 0 |
| 0.936111111111111 | 0 |
| 0.9368055555555556 | 0 |
| 0.9375 | 0 |
| 0.9381944444444444 | 0 |
| 0.938888888888889 | 0 |
| 0.9395833333333333 | 0 |
| 0.9402777777777778 | 0 |
| 0.9409722222222222 | 0 |
| 0.9416666666666668 | 0 |
| 0.9423611111111111 | 0 |
| 0.9430555555555555 | 0 |
| 0.94375 | 0 |
| 0.9444444444444445 | 0 |
| 0.9451388888888889 | 0 |
| 0.9458333333333333 | 0 |
| 0.9465277777777777 | 0 |
| 0.9472222222222223 | 0 |
| 0.9479166666666666 | 0 |
| 0.9486111111111111 | 0 |
| 0.9493055555555556 | 0 |
| 0.9500000000000001 | 0 |
| 0.9506944444444444 | 0 |
| 0.9513888888888888 | 0 |
| 0.9520833333333334 | 0 |
| 0.9527777777777778 | 0 |
| 0.9534722222222222 | 0 |
| 0.9541666666666666 | 0 |
| 0.9548611111111112 | 0 |
| 0.9555555555555556 | 0 |
| 0.9562499999999999 | 0 |
| 0.9569444444444444 | 0 |
| 0.9576388888888889 | 0 |
| 0.9583333333333334 | 0 |
| 0.9590277777777777 | 0 |
| 0.9597222222222223 | 0 |
| 0.9604166666666667 | 0 |
| 0.9611111111111111 | 0 |
| 0.9618055555555555 | 0 |
| 0.9625 | 0 |
| 0.9631944444444445 | 0 |
| 0.9638888888888889 | 0 |
| 0.9645833333333332 | 0 |
| 0.9652777777777778 | 0 |
| 0.9659722222222222 | 0 |
| 0.9666666666666667 | 0 |
| 0.967361111111111 | 0 |
| 0.9680555555555556 | 0 |
| 0.96875 | 0 |
| 0.9694444444444444 | 0 |
| 0.970138888888889 | 0 |
| 0.9708333333333333 | 0 |
| 0.9715277777777778 | 0 |
| 0.9722222222222222 | 0 |
| 0.9729166666666668 | 0 |
| 0.9736111111111111 | 0 |
| 0.9743055555555555 | 0 |
| 0.975 | 0 |
| 0.9756944444444445 | 0 |
| 0.9763888888888889 | 0 |
| 0.9770833333333333 | 0 |
| 0.9777777777777777 | 0 |
| 0.9784722222222223 | 0 |
| 0.9791666666666666 | 0 |
| 0.9798611111111111 | 0 |
| 0.9805555555555556 | 0 |
| 0.9812500000000001 | 0 |
| 0.9819444444444444 | 0 |
| 0.9826388888888888 | 0 |
| 0.9833333333333334 | 0 |
| 0.9840277777777778 | 0 |
| 0.9847222222222222 | 0 |
| 0.9854166666666666 | 0 |
| 0.9861111111111112 | 0 |
| 0.9868055555555556 | 0 |
| 0.9874999999999999 | 0 |
| 0.9881944444444444 | 0 |
| 0.9888888888888889 | 0 |
| 0.9895833333333334 | 0 |
| 0.9902777777777777 | 0 |
| 0.9909722222222223 | 0 |
| 0.9916666666666667 | 0 |
| 0.9923611111111111 | 0 |
| 0.9930555555555555 | 0 |
| 0.99375 | 0 |
| 0.9944444444444445 | 0 |
| 0.9951388888888889 | 0 |
| 0.9958333333333332 | 0 |
| 0.9965277777777778 | 0 |
| 0.9972222222222222 | 0 |
| 0.9979166666666667 | 0 |
| 0.998611111111111 | 0 |
| 0.9993055555555556 | 0 |